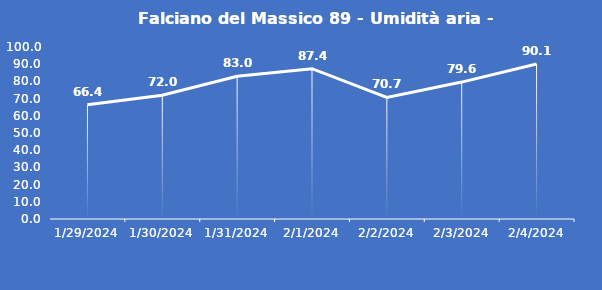
| Category | Falciano del Massico 89 - Umidità aria - Grezzo (%) |
|---|---|
| 1/29/24 | 66.4 |
| 1/30/24 | 72 |
| 1/31/24 | 83 |
| 2/1/24 | 87.4 |
| 2/2/24 | 70.7 |
| 2/3/24 | 79.6 |
| 2/4/24 | 90.1 |